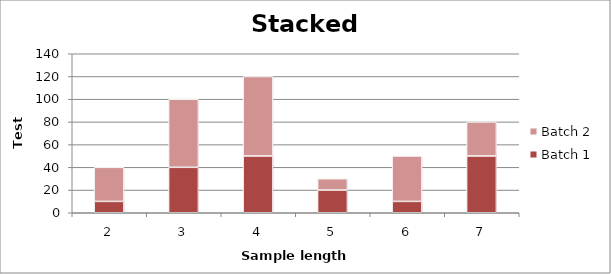
| Category | Batch 1 | Batch 2 |
|---|---|---|
| 2.0 | 10 | 30 |
| 3.0 | 40 | 60 |
| 4.0 | 50 | 70 |
| 5.0 | 20 | 10 |
| 6.0 | 10 | 40 |
| 7.0 | 50 | 30 |